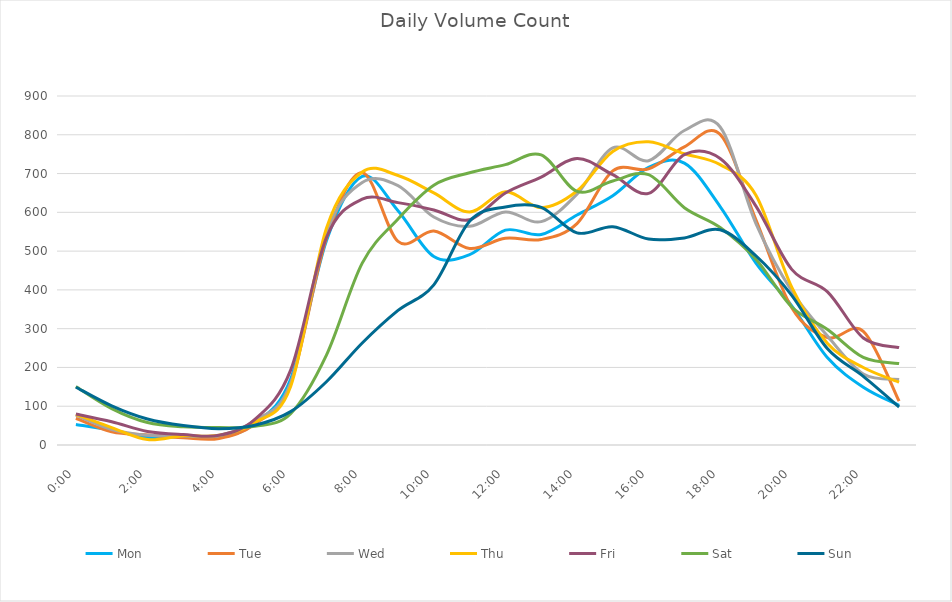
| Category | Mon | Tue | Wed | Thu | Fri | Sat | Sun |
|---|---|---|---|---|---|---|---|
| 0.0 | 53 | 69 | 77 | 79 | 80 | 151 | 149 |
| 0.0416666666666667 | 38 | 34 | 40 | 45 | 60 | 94 | 101 |
| 0.0833333333333333 | 20 | 26 | 25 | 14 | 35 | 58 | 67 |
| 0.125 | 22 | 19 | 23 | 24 | 27 | 47 | 50 |
| 0.166666666666667 | 19 | 17 | 24 | 25 | 25 | 45 | 42 |
| 0.208333333333333 | 56 | 54 | 63 | 58 | 66 | 48 | 51 |
| 0.25 | 170 | 159 | 159 | 151 | 193 | 81 | 86 |
| 0.291666666666667 | 527 | 533 | 547 | 559 | 535 | 232 | 163 |
| 0.333333333333333 | 693 | 702 | 677 | 704 | 634 | 469 | 263 |
| 0.375 | 604 | 525 | 669 | 695 | 625 | 583 | 347 |
| 0.416666666666667 | 486 | 552 | 588 | 650 | 606 | 670 | 413 |
| 0.4583333333333333 | 491 | 507 | 564 | 601 | 581 | 702 | 577 |
| 0.5 | 554 | 533 | 601 | 653 | 650 | 723 | 614 |
| 0.541666666666667 | 543 | 530 | 576 | 612 | 691 | 748 | 613 |
| 0.5833333333333334 | 593 | 571 | 647 | 655 | 739 | 654 | 547 |
| 0.625 | 643 | 707 | 766 | 757 | 697 | 681 | 563 |
| 0.666666666666667 | 716 | 712 | 733 | 782 | 649 | 697 | 531 |
| 0.7083333333333334 | 727 | 769 | 811 | 751 | 749 | 612 | 534 |
| 0.75 | 615 | 801 | 820 | 723 | 739 | 561 | 555 |
| 0.791666666666667 | 469 | 581 | 571 | 644 | 616 | 479 | 488 |
| 0.8333333333333334 | 359 | 354 | 397 | 407 | 453 | 356 | 386 |
| 0.875 | 225 | 277 | 281 | 262 | 395 | 298 | 248 |
| 0.916666666666667 | 149 | 293 | 183 | 200 | 276 | 226 | 177 |
| 0.9583333333333334 | 102 | 113 | 169 | 162 | 251 | 210 | 98 |